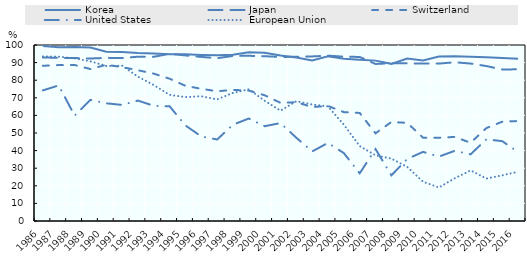
| Category | Korea | Japan | Switzerland | United States | European Union |
|---|---|---|---|---|---|
| 1986.0 | 99.461 | 92.909 | 88.197 | 74.218 | 93.509 |
| 1987.0 | 98.79 | 92.722 | 88.59 | 77.038 | 93.38 |
| 1988.0 | 98.889 | 92.595 | 88.634 | 59.847 | 92.399 |
| 1989.0 | 98.517 | 92.319 | 86.334 | 68.827 | 90.724 |
| 1990.0 | 96.181 | 92.699 | 88.776 | 66.874 | 88.071 |
| 1991.0 | 96.003 | 92.622 | 87.425 | 65.948 | 88.254 |
| 1992.0 | 95.397 | 93.347 | 85.657 | 68.418 | 82.011 |
| 1993.0 | 95.206 | 93.303 | 83.719 | 65.464 | 77.251 |
| 1994.0 | 94.797 | 94.993 | 80.839 | 65.162 | 71.658 |
| 1995.0 | 94.707 | 94.078 | 76.818 | 54.282 | 70.398 |
| 1996.0 | 94.352 | 93.221 | 75.11 | 48.039 | 70.887 |
| 1997.0 | 94.162 | 92.502 | 73.718 | 46.306 | 69.06 |
| 1998.0 | 94.435 | 93.791 | 74.501 | 54.73 | 72.809 |
| 1999.0 | 95.852 | 93.854 | 74.096 | 58.22 | 74.827 |
| 2000.0 | 95.625 | 93.625 | 71.424 | 53.863 | 68.311 |
| 2001.0 | 93.983 | 93.223 | 67.122 | 55.631 | 62.686 |
| 2002.0 | 92.836 | 93.291 | 67.499 | 47.286 | 68.074 |
| 2003.0 | 91.233 | 93.51 | 64.762 | 39.531 | 66.174 |
| 2004.0 | 93.558 | 93.939 | 65.351 | 44.384 | 65.114 |
| 2005.0 | 92.124 | 93.372 | 61.86 | 38.581 | 54.724 |
| 2006.0 | 91.644 | 93.21 | 61.391 | 27.083 | 42.578 |
| 2007.0 | 91.123 | 89.231 | 49.811 | 40.866 | 37.31 |
| 2008.0 | 89.29 | 89.621 | 56.265 | 25.949 | 35.452 |
| 2009.0 | 92.358 | 89.58 | 55.766 | 35.247 | 30.727 |
| 2010.0 | 91.185 | 89.466 | 47.339 | 39.28 | 22.317 |
| 2011.0 | 93.455 | 89.449 | 47.288 | 36.592 | 19.037 |
| 2012.0 | 93.652 | 90.189 | 47.777 | 39.868 | 24.262 |
| 2013.0 | 93.288 | 89.462 | 44.456 | 37.885 | 28.744 |
| 2014.0 | 93.037 | 88.038 | 52.801 | 46.424 | 24.129 |
| 2015.0 | 92.635 | 86.073 | 56.404 | 45.363 | 25.921 |
| 2016.0 | 92.143 | 86.196 | 56.808 | 39.14 | 27.971 |